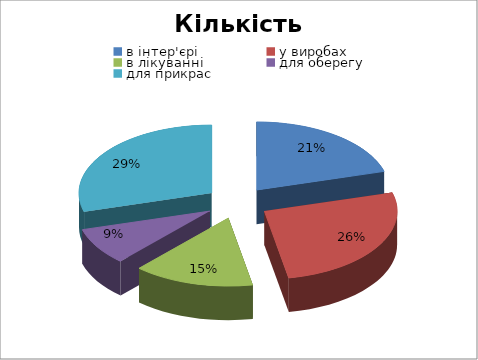
| Category | Кількість осіб |
|---|---|
| в інтер'єрі | 7 |
| у виробах | 9 |
| в лікуванні | 5 |
| для оберегу | 3 |
| для прикрас | 10 |